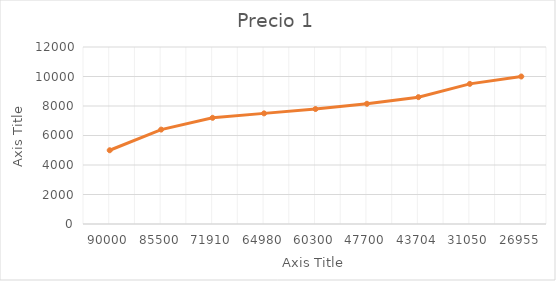
| Category | Precio 1 |
|---|---|
| 90000.0 | 5000 |
| 85500.0 | 6400 |
| 71910.0 | 7200 |
| 64980.0 | 7500 |
| 60300.0 | 7795 |
| 47700.0 | 8150 |
| 43704.0 | 8600 |
| 31050.0 | 9500 |
| 26955.0 | 10000 |